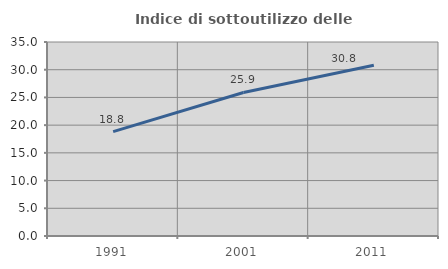
| Category | Indice di sottoutilizzo delle abitazioni  |
|---|---|
| 1991.0 | 18.837 |
| 2001.0 | 25.89 |
| 2011.0 | 30.806 |